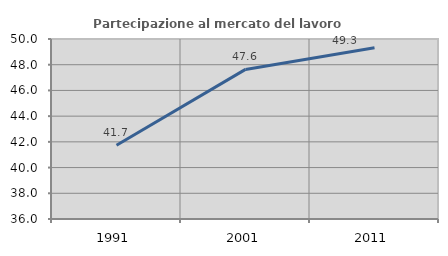
| Category | Partecipazione al mercato del lavoro  femminile |
|---|---|
| 1991.0 | 41.74 |
| 2001.0 | 47.635 |
| 2011.0 | 49.319 |